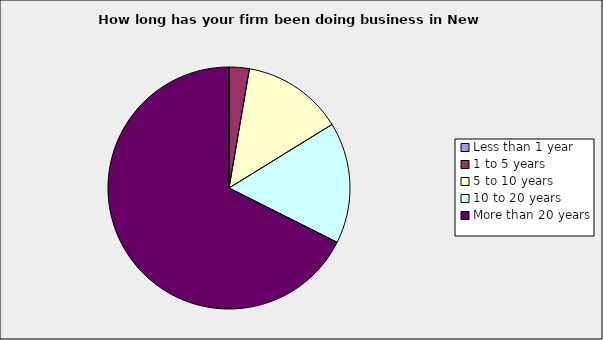
| Category | Series 0 |
|---|---|
| Less than 1 year | 0 |
| 1 to 5 years | 0.027 |
| 5 to 10 years | 0.135 |
| 10 to 20 years | 0.162 |
| More than 20 years | 0.676 |